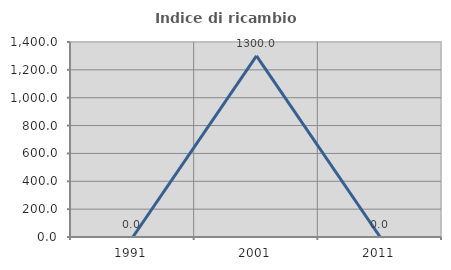
| Category | Indice di ricambio occupazionale  |
|---|---|
| 1991.0 | 0 |
| 2001.0 | 1300 |
| 2011.0 | 0 |